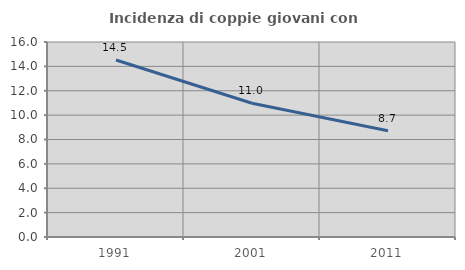
| Category | Incidenza di coppie giovani con figli |
|---|---|
| 1991.0 | 14.519 |
| 2001.0 | 10.977 |
| 2011.0 | 8.725 |